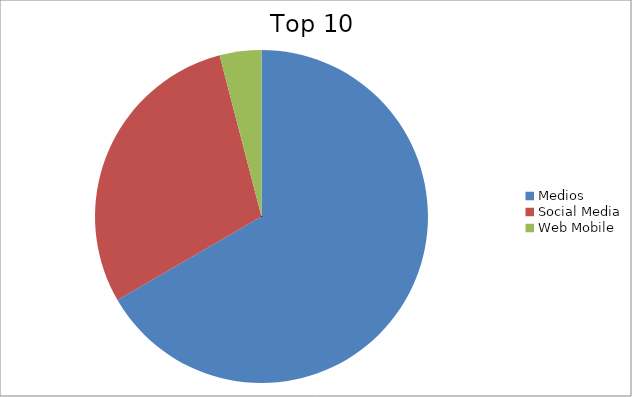
| Category | Series 0 |
|---|---|
| Medios | 66.63 |
| Social Media | 29.31 |
| Web Mobile | 4.05 |